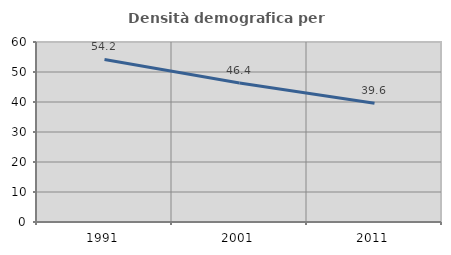
| Category | Densità demografica |
|---|---|
| 1991.0 | 54.182 |
| 2001.0 | 46.367 |
| 2011.0 | 39.553 |